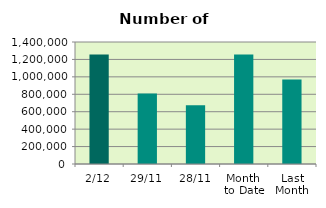
| Category | Series 0 |
|---|---|
| 2/12 | 1255750 |
| 29/11 | 807754 |
| 28/11 | 674844 |
| Month 
to Date | 1255750 |
| Last
Month | 969317.238 |